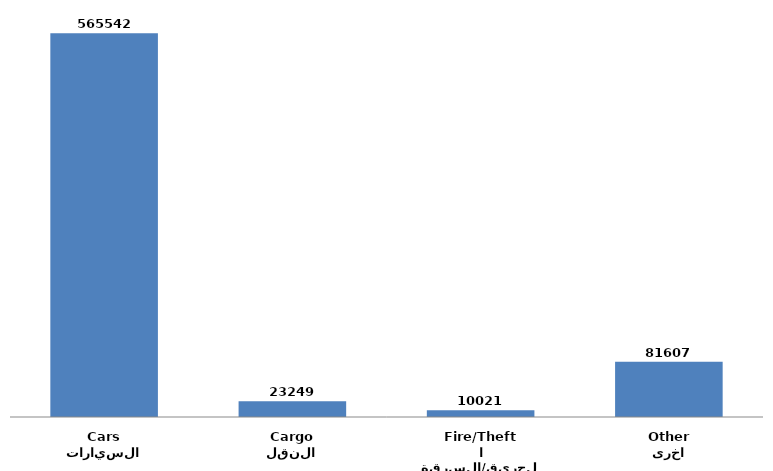
| Category | Series 0 |
|---|---|
| السيارات
Cars | 565542 |
| النقل
Cargo | 23249 |
| الحريق/السرقة
Fire/Theft | 10021 |
| اخرى
Other | 81607 |